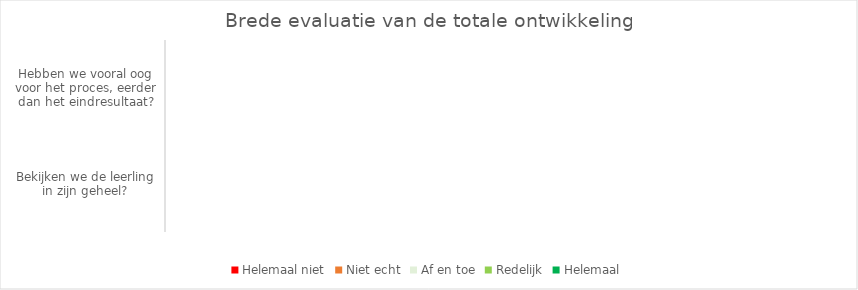
| Category | Helemaal niet | Niet echt | Af en toe | Redelijk | Helemaal |
|---|---|---|---|---|---|
| Bekijken we de leerling in zijn geheel? | 0 | 0 | 0 | 0 | 0 |
| Hebben we vooral oog voor het proces, eerder dan het eindresultaat? | 0 | 0 | 0 | 0 | 0 |